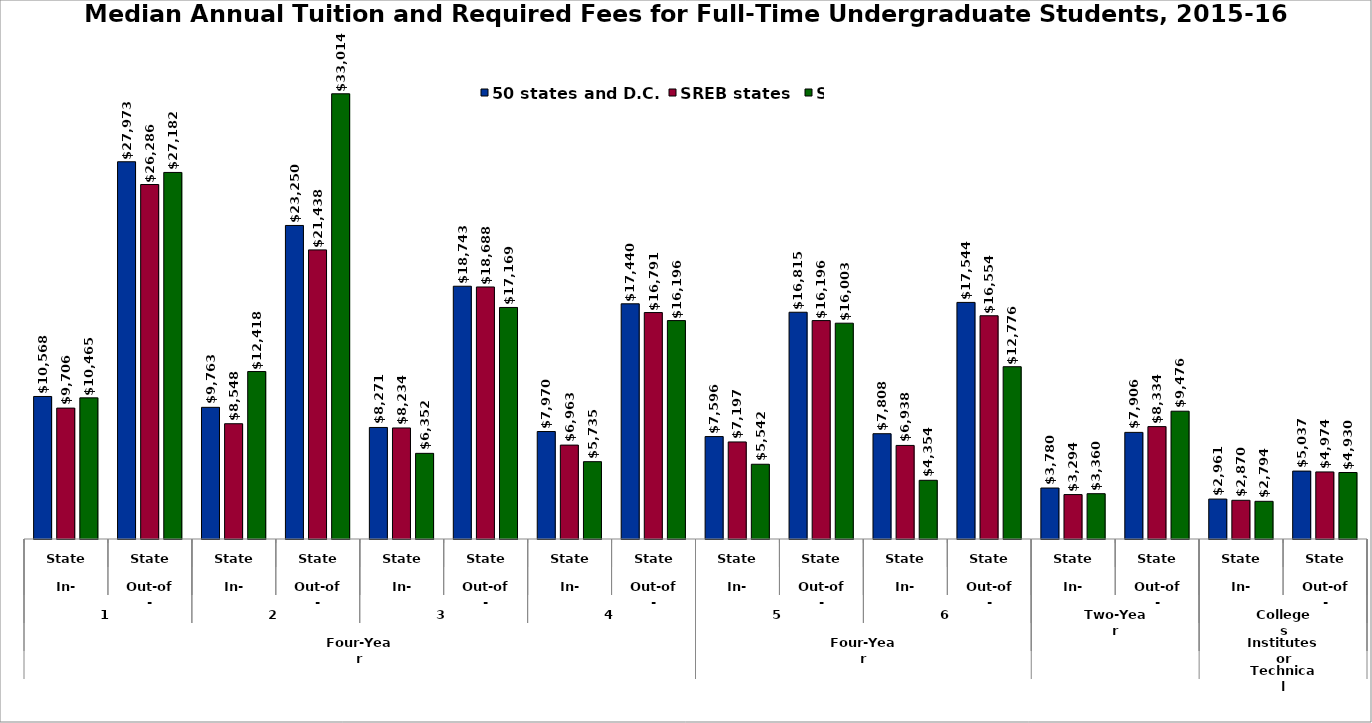
| Category | 50 states and D.C. | SREB states | State |
|---|---|---|---|
| 0 | 10568 | 9706 | 10465 |
| 1 | 27973 | 26286 | 27181.5 |
| 2 | 9763 | 8548 | 12418 |
| 3 | 23250 | 21438 | 33014 |
| 4 | 8271 | 8233.5 | 6351.5 |
| 5 | 18742.5 | 18688 | 17169 |
| 6 | 7970 | 6963 | 5735 |
| 7 | 17440 | 16791 | 16196 |
| 8 | 7596 | 7197 | 5542 |
| 9 | 16815 | 16196 | 16003 |
| 10 | 7808 | 6938 | 4354 |
| 11 | 17544 | 16554 | 12776 |
| 12 | 3779.5 | 3294 | 3360 |
| 13 | 7906 | 8333.5 | 9476 |
| 14 | 2961 | 2870 | 2794 |
| 15 | 5036.5 | 4974 | 4930 |